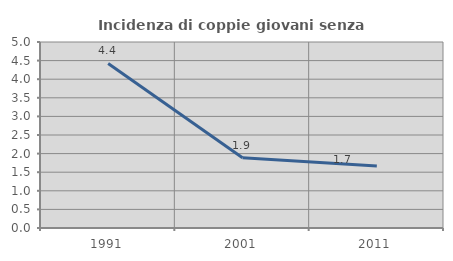
| Category | Incidenza di coppie giovani senza figli |
|---|---|
| 1991.0 | 4.425 |
| 2001.0 | 1.887 |
| 2011.0 | 1.667 |